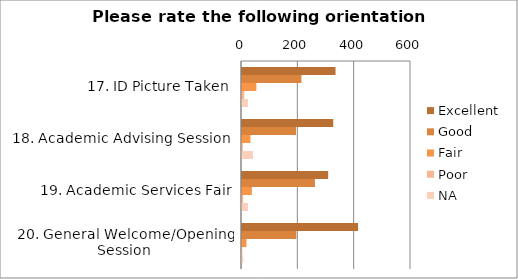
| Category | Excellent | Good | Fair | Poor | NA |
|---|---|---|---|---|---|
| 17. ID Picture Taken | 332 | 211 | 51 | 8 | 21 |
| 18. Academic Advising Session | 324 | 192 | 30 | 3 | 39 |
| 19. Academic Services Fair | 306 | 259 | 35 | 4 | 21 |
| 20. General Welcome/Opening Session | 412 | 193 | 16 | 1 | 4 |